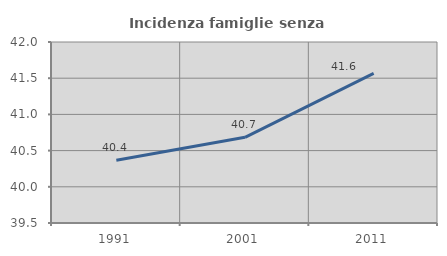
| Category | Incidenza famiglie senza nuclei |
|---|---|
| 1991.0 | 40.367 |
| 2001.0 | 40.683 |
| 2011.0 | 41.566 |